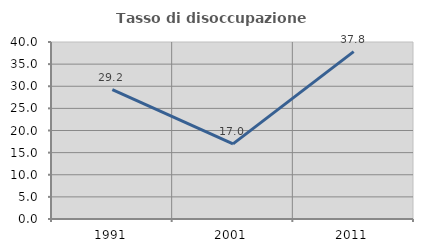
| Category | Tasso di disoccupazione giovanile  |
|---|---|
| 1991.0 | 29.219 |
| 2001.0 | 16.974 |
| 2011.0 | 37.838 |